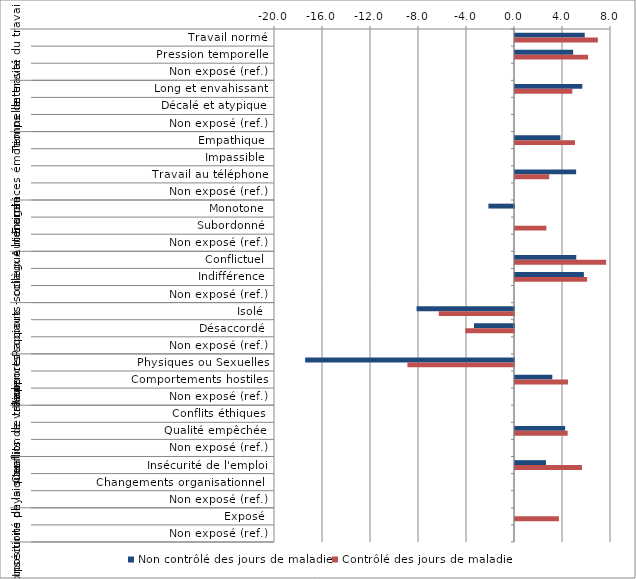
| Category | Non contrôlé des jours de maladie | Contrôlé des jours de maladie |
|---|---|---|
| 0 | 5.812 | 6.901 |
| 1 | 4.849 | 6.095 |
| 2 | 0 | 0 |
| 3 | 5.61 | 4.778 |
| 4 | 0 | 0 |
| 5 | 0 | 0 |
| 6 | 3.787 | 4.998 |
| 7 | 0 | 0 |
| 8 | 5.094 | 2.85 |
| 9 | 0 | 0 |
| 10 | -2.132 | 0 |
| 11 | 0 | 2.613 |
| 12 | 0 | 0 |
| 13 | 5.104 | 7.596 |
| 14 | 5.74 | 6.011 |
| 15 | 0 | 0 |
| 16 | -8.117 | -6.267 |
| 17 | -3.334 | -4.054 |
| 18 | 0 | 0 |
| 19 | -17.403 | -8.881 |
| 20 | 3.109 | 4.414 |
| 21 | 0 | 0 |
| 22 | 0 | 0 |
| 23 | 4.179 | 4.392 |
| 24 | 0 | 0 |
| 25 | 2.581 | 5.583 |
| 26 | 0 | 0 |
| 27 | 0 | 0 |
| 28 | 0 | 3.662 |
| 29 | 0 | 0 |